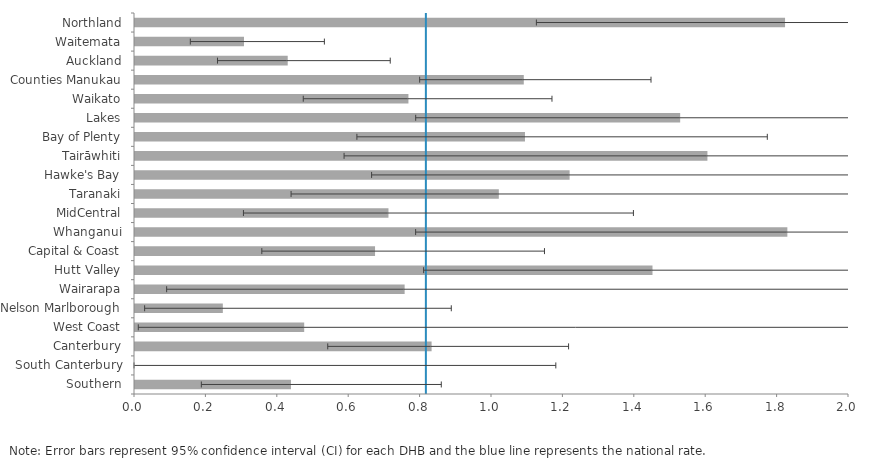
| Category | DHB |
|---|---|
| Northland | 1.821 |
| Waitemata | 0.305 |
| Auckland | 0.428 |
| Counties Manukau | 1.089 |
| Waikato | 0.766 |
| Lakes | 1.527 |
| Bay of Plenty | 1.092 |
| Tairāwhiti | 1.603 |
| Hawke's Bay | 1.217 |
| Taranaki | 1.019 |
| MidCentral | 0.71 |
| Whanganui | 1.827 |
| Capital & Coast | 0.672 |
| Hutt Valley | 1.45 |
| Wairarapa | 0.755 |
| Nelson Marlborough | 0.246 |
| West Coast | 0.474 |
| Canterbury | 0.831 |
| South Canterbury | 0 |
| Southern | 0.437 |